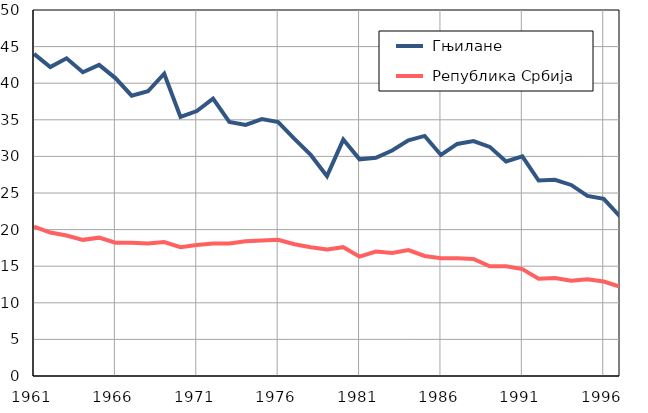
| Category |  Гњилане |  Република Србија |
|---|---|---|
| 1961.0 | 44 | 20.4 |
| 1962.0 | 42.2 | 19.6 |
| 1963.0 | 43.4 | 19.2 |
| 1964.0 | 41.5 | 18.6 |
| 1965.0 | 42.5 | 18.9 |
| 1966.0 | 40.7 | 18.2 |
| 1967.0 | 38.3 | 18.2 |
| 1968.0 | 38.9 | 18.1 |
| 1969.0 | 41.3 | 18.3 |
| 1970.0 | 35.4 | 17.6 |
| 1971.0 | 36.2 | 17.9 |
| 1972.0 | 37.9 | 18.1 |
| 1973.0 | 34.7 | 18.1 |
| 1974.0 | 34.3 | 18.4 |
| 1975.0 | 35.1 | 18.5 |
| 1976.0 | 34.7 | 18.6 |
| 1977.0 | 32.4 | 18 |
| 1978.0 | 30.2 | 17.6 |
| 1979.0 | 27.3 | 17.3 |
| 1980.0 | 32.3 | 17.6 |
| 1981.0 | 29.6 | 16.3 |
| 1982.0 | 29.8 | 17 |
| 1983.0 | 30.8 | 16.8 |
| 1984.0 | 32.2 | 17.2 |
| 1985.0 | 32.8 | 16.4 |
| 1986.0 | 30.2 | 16.1 |
| 1987.0 | 31.7 | 16.1 |
| 1988.0 | 32.1 | 16 |
| 1989.0 | 31.3 | 15 |
| 1990.0 | 29.3 | 15 |
| 1991.0 | 30 | 14.6 |
| 1992.0 | 26.7 | 13.3 |
| 1993.0 | 26.8 | 13.4 |
| 1994.0 | 26.1 | 13 |
| 1995.0 | 24.6 | 13.2 |
| 1996.0 | 24.2 | 12.9 |
| 1997.0 | 21.8 | 12.2 |